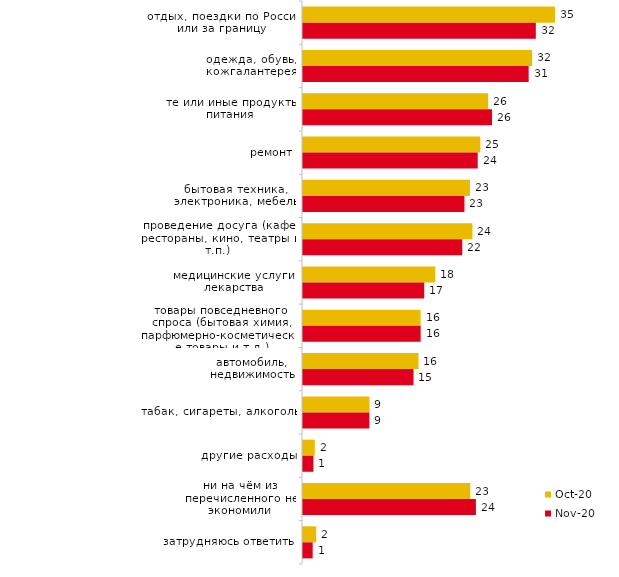
| Category | окт.20 | ноя.20 |
|---|---|---|
| отдых, поездки по России или за границу | 35.127 | 32.45 |
| одежда, обувь, кожгалантерея | 31.938 | 31.45 |
| те или иные продукты питания | 25.81 | 26.35 |
| ремонт | 24.714 | 24.35 |
| бытовая техника, электроника, мебель | 23.269 | 22.5 |
| проведение досуга (кафе, рестораны, кино, театры и т.п.) | 23.617 | 22.2 |
| медицинские услуги, лекарства | 18.435 | 16.9 |
| товары повседневного спроса (бытовая химия, парфюмерно-косметические товары и т.д.) | 16.393 | 16.4 |
| автомобиль, недвижимость | 16.094 | 15.4 |
| табак, сигареты, алкоголь | 9.268 | 9.25 |
| другие расходы | 1.644 | 1.45 |
| ни на чём из перечисленного не экономили | 23.318 | 24.1 |
| затрудняюсь ответить | 1.844 | 1.35 |